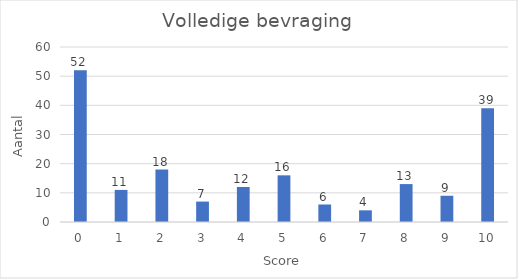
| Category | Aantal |
|---|---|
| 0.0 | 52 |
| 1.0 | 11 |
| 2.0 | 18 |
| 3.0 | 7 |
| 4.0 | 12 |
| 5.0 | 16 |
| 6.0 | 6 |
| 7.0 | 4 |
| 8.0 | 13 |
| 9.0 | 9 |
| 10.0 | 39 |